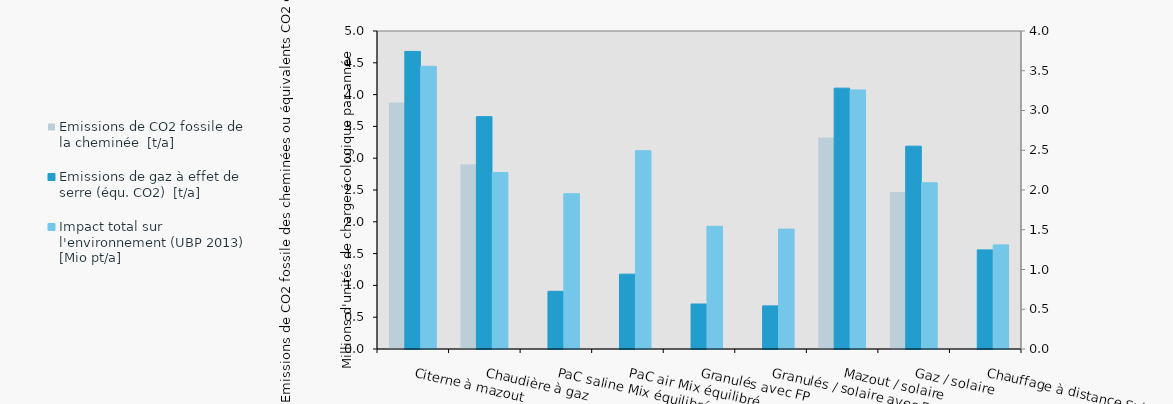
| Category | Emissions de CO2 fossile de la cheminée | Emissions de gaz à effet de serre (équ. CO2) | Series 4 |
|---|---|---|---|
| Citerne à mazout | 3.875 | 4.679 |  |
| Chaudière à gaz | 2.903 | 3.654 |  |
| PaC saline Mix équilibré | 0 | 0.907 |  |
| PaC air Mix équilibré | 0 | 1.177 |  |
| Granulés avec FP | 0 | 0.708 |  |
| Granulés / solaire avec FP | 0 | 0.678 |  |
| Mazout / solaire | 3.327 | 4.101 |  |
| Gaz / solaire | 2.468 | 3.189 |  |
| Chauffage à distance Suisse | 0 | 1.558 |  |